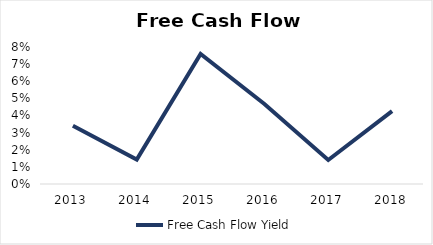
| Category | Free Cash Flow Yield |
|---|---|
| 2013.0 | 0.034 |
| 2014.0 | 0.014 |
| 2015.0 | 0.076 |
| 2016.0 | 0.047 |
| 2017.0 | 0.014 |
| 2018.0 | 0.043 |